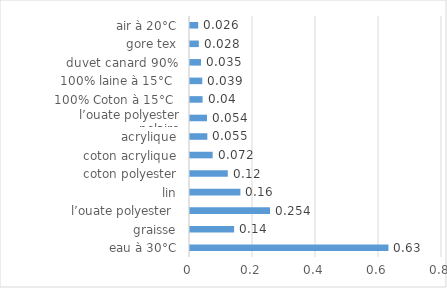
| Category | Series 0 |
|---|---|
| eau à 30°C | 0.63 |
| graisse | 0.14 |
| l’ouate polyester  | 0.254 |
| lin | 0.16 |
| coton polyester | 0.12 |
| coton acrylique | 0.072 |
| acrylique | 0.055 |
| l’ouate polyester polaire | 0.054 |
| 100% Coton à 15°C  | 0.04 |
| 100% laine à 15°C  | 0.039 |
| duvet canard 90% | 0.035 |
| gore tex | 0.028 |
| air à 20°C | 0.026 |